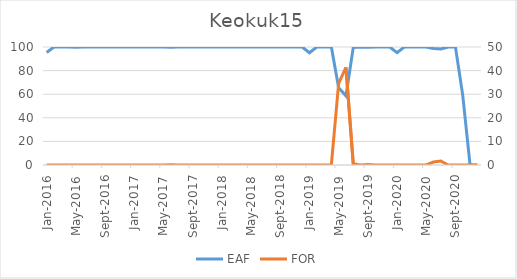
| Category | EAF |
|---|---|
| 2016-01-01 | 95.39 |
| 2016-02-01 | 100 |
| 2016-03-01 | 100 |
| 2016-04-01 | 100 |
| 2016-05-01 | 99.81 |
| 2016-06-01 | 100 |
| 2016-07-01 | 100 |
| 2016-08-01 | 100 |
| 2016-09-01 | 100 |
| 2016-10-01 | 100 |
| 2016-11-01 | 100 |
| 2016-12-01 | 100 |
| 2017-01-01 | 100 |
| 2017-02-01 | 100 |
| 2017-03-01 | 100 |
| 2017-04-01 | 100 |
| 2017-05-01 | 100 |
| 2017-06-01 | 99.86 |
| 2017-07-01 | 100 |
| 2017-08-01 | 100 |
| 2017-09-01 | 100 |
| 2017-10-01 | 100 |
| 2017-11-01 | 100 |
| 2017-12-01 | 100 |
| 2018-01-01 | 100 |
| 2018-02-01 | 100 |
| 2018-03-01 | 100 |
| 2018-04-01 | 100 |
| 2018-05-01 | 100 |
| 2018-06-01 | 100 |
| 2018-07-01 | 100 |
| 2018-08-01 | 100 |
| 2018-09-01 | 100 |
| 2018-10-01 | 100 |
| 2018-11-01 | 100 |
| 2018-12-01 | 100 |
| 2019-01-01 | 95.14 |
| 2019-02-01 | 100 |
| 2019-03-01 | 100 |
| 2019-04-01 | 100 |
| 2019-05-01 | 65.46 |
| 2019-06-01 | 58.61 |
| 2019-07-01 | 99.48 |
| 2019-08-01 | 100 |
| 2019-09-01 | 99.81 |
| 2019-10-01 | 100 |
| 2019-11-01 | 100 |
| 2019-12-01 | 100 |
| 2020-01-01 | 95.17 |
| 2020-02-01 | 100 |
| 2020-03-01 | 100 |
| 2020-04-01 | 100 |
| 2020-05-01 | 100 |
| 2020-06-01 | 98.74 |
| 2020-07-01 | 98.32 |
| 2020-08-01 | 100 |
| 2020-09-01 | 100 |
| 2020-10-01 | 59.01 |
| 2020-11-01 | 0 |
| 2020-12-01 | 0 |